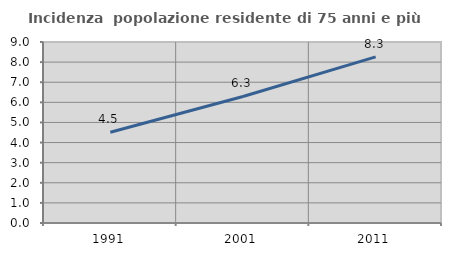
| Category | Incidenza  popolazione residente di 75 anni e più |
|---|---|
| 1991.0 | 4.513 |
| 2001.0 | 6.291 |
| 2011.0 | 8.259 |